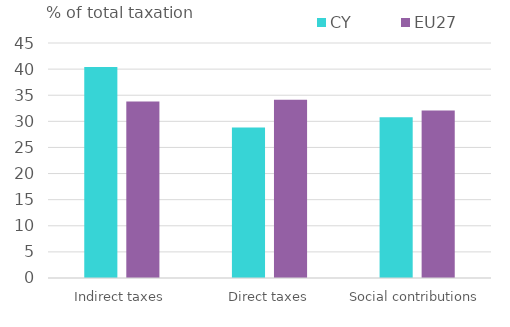
| Category | CY | EU27 |
|---|---|---|
| Indirect taxes | 40.418 | 33.811 |
| Direct taxes | 28.819 | 34.133 |
| Social contributions | 30.763 | 32.056 |